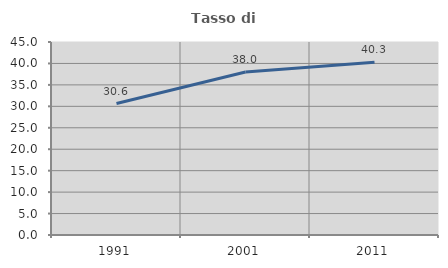
| Category | Tasso di occupazione   |
|---|---|
| 1991.0 | 30.642 |
| 2001.0 | 37.995 |
| 2011.0 | 40.278 |